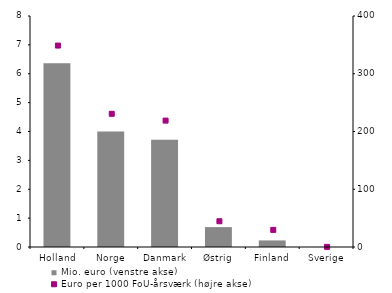
| Category | Mio. euro (venstre akse) |
|---|---|
| Holland | 6.362 |
| Norge | 3.999 |
| Danmark | 3.714 |
| Østrig | 0.688 |
| Finland | 0.228 |
| Sverige | 0.002 |